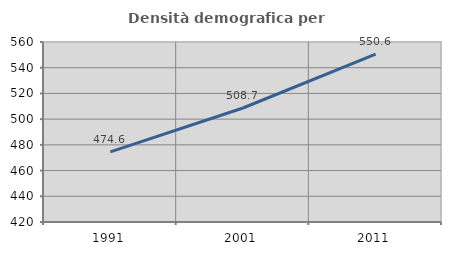
| Category | Densità demografica |
|---|---|
| 1991.0 | 474.573 |
| 2001.0 | 508.659 |
| 2011.0 | 550.61 |